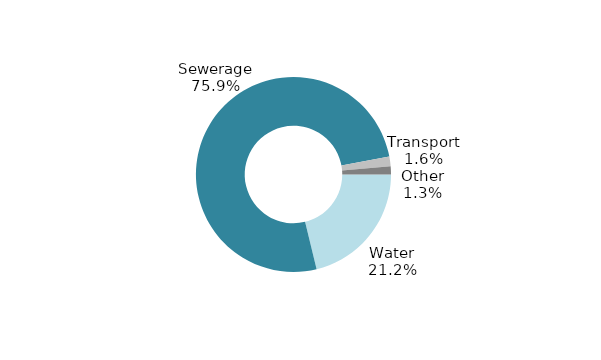
| Category | Series 3 |
|---|---|
| Water | 0.212 |
| Sewerage | 0.759 |
| Transport | 0.016 |
| Other | 0.013 |